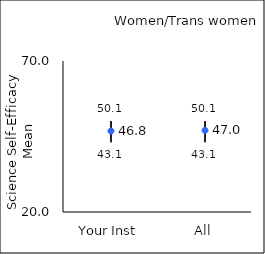
| Category | 25th percentile | 75th percentile | Mean |
|---|---|---|---|
| Your Inst | 43.1 | 50.1 | 46.8 |
| All | 43.1 | 50.1 | 47.03 |